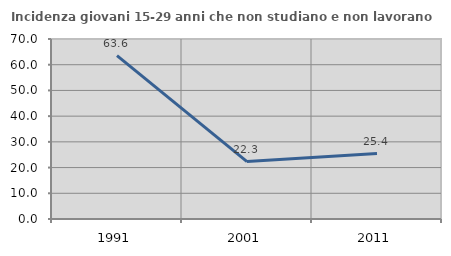
| Category | Incidenza giovani 15-29 anni che non studiano e non lavorano  |
|---|---|
| 1991.0 | 63.551 |
| 2001.0 | 22.318 |
| 2011.0 | 25.439 |